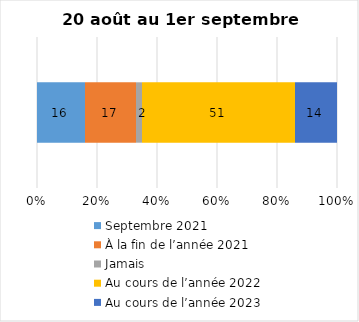
| Category | Septembre 2021 | À la fin de l’année 2021 | Jamais | Au cours de l’année 2022 | Au cours de l’année 2023 |
|---|---|---|---|---|---|
| 0 | 16 | 17 | 2 | 51 | 14 |